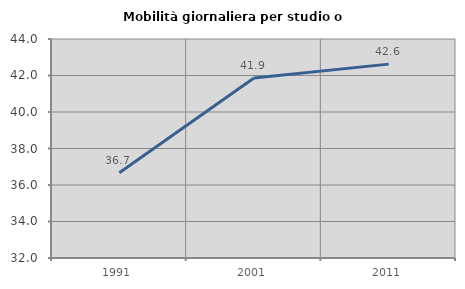
| Category | Mobilità giornaliera per studio o lavoro |
|---|---|
| 1991.0 | 36.676 |
| 2001.0 | 41.865 |
| 2011.0 | 42.623 |